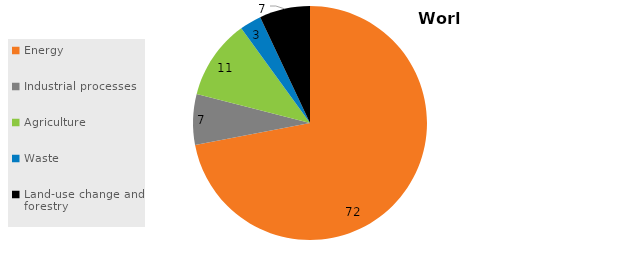
| Category | World |
|---|---|
| Energy | 72 |
| Industrial processes | 7 |
| Agriculture | 11 |
| Waste | 3 |
| Land-use change and forestry | 7 |